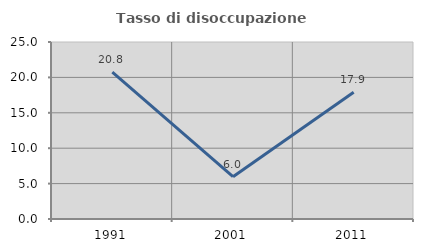
| Category | Tasso di disoccupazione giovanile  |
|---|---|
| 1991.0 | 20.755 |
| 2001.0 | 5.97 |
| 2011.0 | 17.91 |